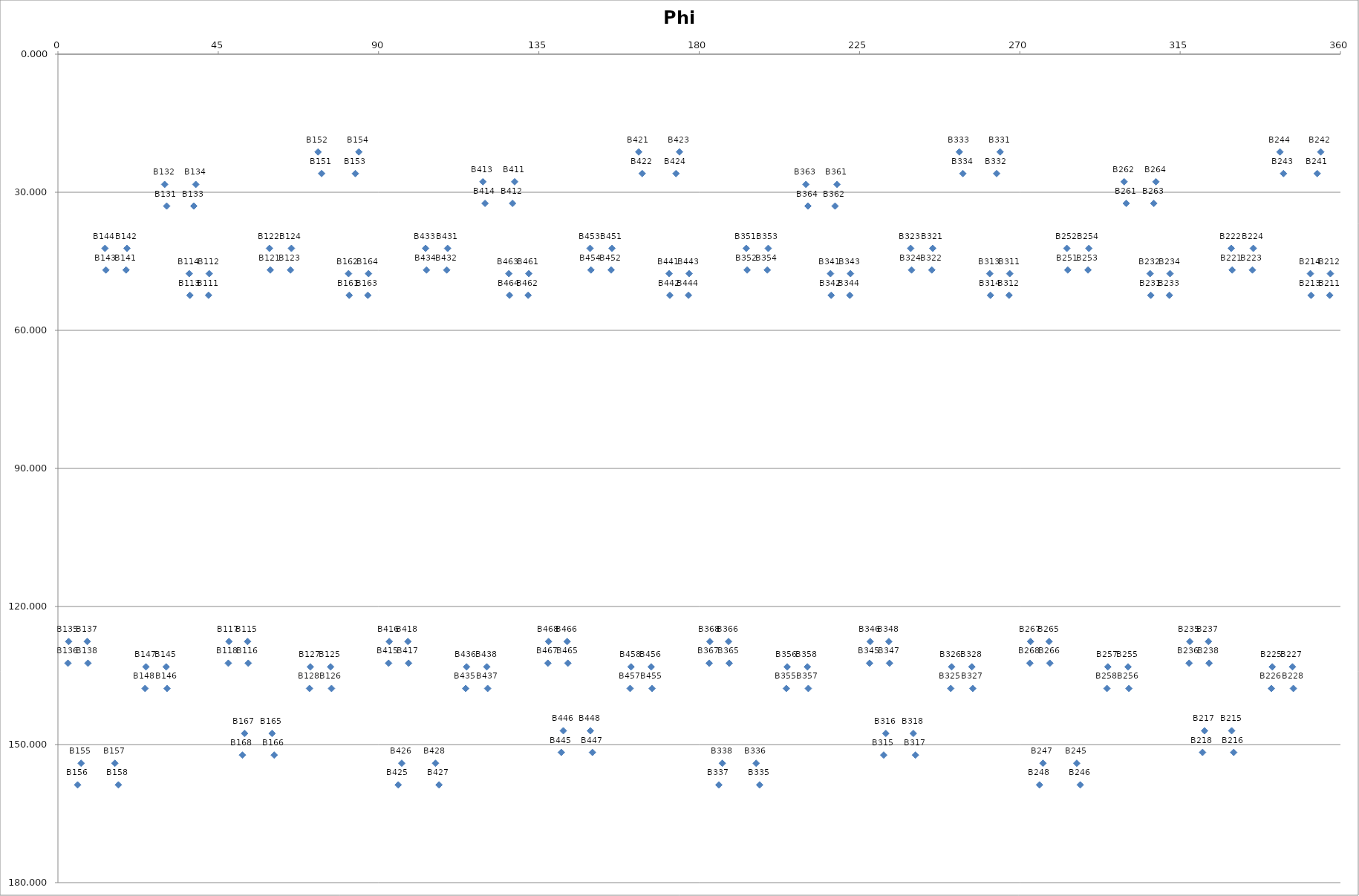
| Category | Phi |
|---|---|
| 42.281192521955525 | 52.384 |
| 42.4678832450463 | 47.679 |
| 37.05080747804444 | 52.384 |
| 36.864116754953486 | 47.679 |
| 53.2401925219554 | 127.616 |
| 53.42688324504647 | 132.321 |
| 48.00980747804419 | 127.616 |
| 47.82311675495351 | 132.321 |
| 59.61727239218759 | 46.89 |
| 59.36979510201615 | 42.186 |
| 65.29272760781234 | 46.89 |
| 65.54020489798388 | 42.186 |
| 76.54272760781234 | 133.11 |
| 76.79020489798361 | 137.814 |
| 70.867272392187 | 133.11 |
| 70.61979510201533 | 137.814 |
| 30.526495786410223 | 32.995 |
| 29.959189984307695 | 28.296 |
| 38.13750421358999 | 32.995 |
| 38.70481001569217 | 28.296 |
| 3.009807478044318 | 127.616 |
| 2.823116754953381 | 132.321 |
| 8.240192521955553 | 127.616 |
| 8.426883245046344 | 132.321 |
| 19.130727607812744 | 46.89 |
| 19.378204897984062 | 42.186 |
| 13.455272392187306 | 46.89 |
| 13.207795102015941 | 42.186 |
| 30.382727607812765 | 133.11 |
| 30.63020489798426 | 137.814 |
| 24.707272392187377 | 133.11 |
| 24.459795102015857 | 137.814 |
| 74.00923488104513 | 25.933 |
| 73.02458839656207 | 21.241 |
| 83.49076511895309 | 25.933 |
| 84.47541160343805 | 21.241 |
| 6.50923488104598 | 154.067 |
| 5.524588396562345 | 158.759 |
| 15.99076511895417 | 154.067 |
| 16.97541160343767 | 158.759 |
| 81.75980747804363 | 52.384 |
| 81.57311675495363 | 47.679 |
| 86.99019252195357 | 52.384 |
| 87.17688324504682 | 47.679 |
| 60.11614021881093 | 147.586 |
| 60.70704880280533 | 152.284 |
| 52.38385978118932 | 147.586 |
| 51.79295119719447 | 152.284 |
| 356.9901925219557 | 52.384 |
| 357.1768832450466 | 47.679 |
| 351.7598074780445 | 52.384 |
| 351.5731167549536 | 47.679 |
| 329.47350421358976 | 147.005 |
| 330.0408100156923 | 151.704 |
| 321.86249578640997 | 147.005 |
| 321.29518998430785 | 151.704 |
| 329.61727239218726 | 46.89 |
| 329.36979510201576 | 42.186 |
| 335.29272760781265 | 46.89 |
| 335.54020489798415 | 42.186 |
| 340.86927239218727 | 133.11 |
| 340.62179510201594 | 137.814 |
| 346.5447276078127 | 133.11 |
| 346.79220489798405 | 137.814 |
| 306.75980747804465 | 52.384 |
| 306.5731167549535 | 47.679 |
| 311.9901925219558 | 52.384 |
| 312.17688324504644 | 47.679 |
| 317.7188074780445 | 127.616 |
| 317.53211675495373 | 132.321 |
| 322.9491925219556 | 127.616 |
| 323.1358832450465 | 132.321 |
| 353.490765118954 | 25.933 |
| 354.4754116034377 | 21.241 |
| 344.0092348810458 | 25.933 |
| 343.02458839656236 | 21.241 |
| 285.9907651189552 | 154.067 |
| 286.9754116034378 | 158.759 |
| 276.50923488104763 | 154.067 |
| 275.5245883965614 | 158.759 |
| 283.4572723921877 | 46.89 |
| 283.20979510201636 | 42.186 |
| 289.132727607813 | 46.89 |
| 289.3802048979837 | 42.186 |
| 300.3827276078124 | 133.11 |
| 300.63020489798447 | 137.814 |
| 294.7072723921877 | 133.11 |
| 294.45979510201613 | 137.814 |
| 299.88385978118885 | 32.414 |
| 299.2929511971946 | 27.716 |
| 307.61614021881053 | 32.414 |
| 308.2070488028055 | 27.716 |
| 278.2401925219563 | 127.616 |
| 278.4268832450465 | 132.321 |
| 273.0098074780462 | 127.616 |
| 272.82311675495356 | 132.321 |
| 267.1768832450467 | 47.679 |
| 266.9901925219536 | 52.384 |
| 261.5731167549537 | 47.679 |
| 261.7598074780437 | 52.384 |
| 231.79295119719447 | 152.284 |
| 232.38385978118933 | 147.586 |
| 240.70704880280536 | 152.284 |
| 240.11614021881095 | 147.586 |
| 245.54020489798384 | 42.186 |
| 245.2927276078123 | 46.89 |
| 239.36979510201616 | 42.186 |
| 239.6172723921876 | 46.89 |
| 250.6197951020153 | 137.814 |
| 250.867272392187 | 133.11 |
| 256.7902048979836 | 137.814 |
| 256.5427276078123 | 133.11 |
| 264.4754116034381 | 21.241 |
| 263.49076511895305 | 25.933 |
| 253.02458839656205 | 21.241 |
| 254.00923488104516 | 25.933 |
| 196.97541160343766 | 158.759 |
| 195.99076511895416 | 154.067 |
| 185.52458839656234 | 158.759 |
| 186.50923488104598 | 154.067 |
| 216.8641167549535 | 47.679 |
| 217.05080747804445 | 52.384 |
| 222.4678832450463 | 47.679 |
| 222.28119252195555 | 52.384 |
| 227.8231167549535 | 132.321 |
| 228.0098074780446 | 127.616 |
| 233.42688324504647 | 132.321 |
| 233.24019252195583 | 127.616 |
| 193.20779510201592 | 42.186 |
| 193.4552723921873 | 46.89 |
| 199.37820489798406 | 42.186 |
| 199.13072760781273 | 46.89 |
| 204.45979510201587 | 137.814 |
| 204.70727239218738 | 133.11 |
| 210.63020489798424 | 137.814 |
| 210.38272760781277 | 133.11 |
| 218.70481001569217 | 28.296 |
| 218.13750421359 | 32.995 |
| 209.9591899843077 | 28.296 |
| 210.52649578641024 | 32.995 |
| 188.42688324504635 | 132.321 |
| 188.24019252195555 | 127.616 |
| 182.82311675495367 | 132.321 |
| 183.0098074780443 | 127.616 |
| 128.20704880280547 | 27.716 |
| 127.61614021881051 | 32.414 |
| 119.2929511971946 | 27.716 |
| 119.88385978118885 | 32.414 |
| 92.82311675495356 | 132.321 |
| 93.00980747804618 | 127.616 |
| 98.42688324504651 | 132.321 |
| 98.24019252195632 | 127.616 |
| 163.02458839656234 | 21.241 |
| 164.0092348810458 | 25.933 |
| 174.47541160343766 | 21.241 |
| 173.49076511895402 | 25.933 |
| 95.5245883965615 | 158.759 |
| 96.50923488104768 | 154.067 |
| 106.97541160343778 | 158.759 |
| 105.9907651189552 | 154.067 |
| 109.38020489798369 | 42.186 |
| 109.132727607813 | 46.89 |
| 103.20979510201636 | 42.186 |
| 103.45727239218766 | 46.89 |
| 114.45979510201616 | 137.814 |
| 114.70727239218768 | 133.11 |
| 120.6302048979845 | 137.814 |
| 120.38272760781241 | 133.11 |
| 171.57311675495365 | 47.679 |
| 171.75980747804445 | 52.384 |
| 177.17688324504633 | 47.679 |
| 176.9901925219557 | 52.384 |
| 141.2951899843078 | 151.704 |
| 141.86249578640997 | 147.005 |
| 150.04081001569227 | 151.704 |
| 149.47350421358976 | 147.005 |
| 155.54020489798413 | 42.186 |
| 155.29272760781262 | 46.89 |
| 149.36979510201573 | 42.186 |
| 149.61727239218723 | 46.89 |
| 166.79220489798405 | 137.814 |
| 166.5447276078127 | 133.11 |
| 160.62179510201594 | 137.814 |
| 160.86927239218727 | 133.11 |
| 132.17688324504647 | 47.679 |
| 131.99019252195583 | 52.384 |
| 126.5731167549535 | 47.679 |
| 126.75980747804462 | 52.384 |
| 143.13588324504653 | 132.321 |
| 142.94919252195555 | 127.616 |
| 137.53211675495373 | 132.321 |
| 137.71880747804445 | 127.616 |